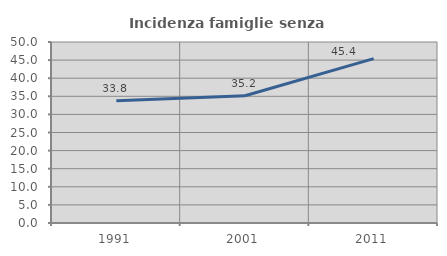
| Category | Incidenza famiglie senza nuclei |
|---|---|
| 1991.0 | 33.75 |
| 2001.0 | 35.152 |
| 2011.0 | 45.399 |